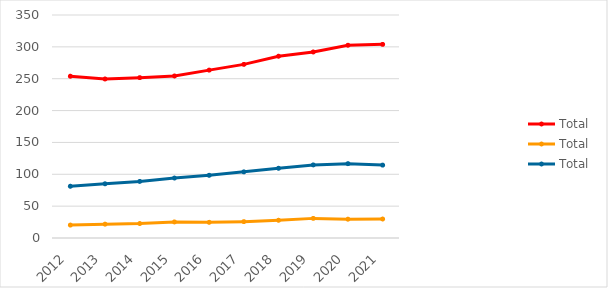
| Category | 1 Ordentliche EL - Total | 3 EL-KK - Total | 6 EL-IPV - Total |
|---|---|---|---|
| 2012 | 253.9 | 20.3 | 81.2 |
| 2013 | 249.6 | 21.7 | 85.1 |
| 2014 | 251.7 | 22.7 | 88.8 |
| 2015 | 254.3 | 25.2 | 94.1 |
| 2016 | 263.5 | 24.6 | 98.4 |
| 2017 | 272.5 | 25.7 | 103.8 |
| 2018 | 285.3 | 27.8 | 109.4 |
| 2019 | 292 | 30.8 | 114.7 |
| 2020 | 302.5 | 29.5 | 116.7 |
| 2021 | 303.9 | 29.8 | 114.4 |